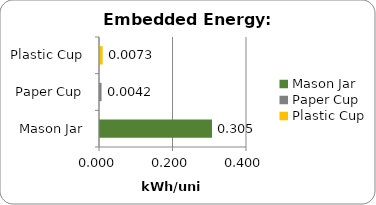
| Category | Series 0 |
|---|---|
| Mason Jar | 0.305 |
| Paper Cup | 0.004 |
| Plastic Cup | 0.007 |